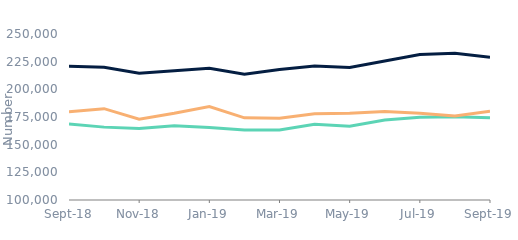
| Category | First-time
buyers | Homemovers | Remortgagors |
|---|---|---|---|
| 2018-09-01 | 168611.296 | 220885.296 | 179667.865 |
| 2018-10-01 | 165850.888 | 219903.413 | 182532.377 |
| 2018-11-01 | 164620.468 | 214516.196 | 173068.207 |
| 2018-12-01 | 167146.087 | 216885.557 | 178401.492 |
| 2019-01-01 | 165427.323 | 219056.564 | 184525.673 |
| 2019-02-01 | 163279.877 | 213639.901 | 174234.146 |
| 2019-03-01 | 163234.705 | 217876.912 | 173927.568 |
| 2019-04-01 | 168510.596 | 221119.807 | 177906.344 |
| 2019-05-01 | 166726.48 | 219810.275 | 178283.176 |
| 2019-06-01 | 172193.122 | 225604.542 | 179981.424 |
| 2019-07-01 | 174805.041 | 231489.447 | 178472.747 |
| 2019-08-01 | 175288.989 | 232555.829 | 175807.105 |
| 2019-09-01 | 174223.494 | 228999.681 | 180119.144 |